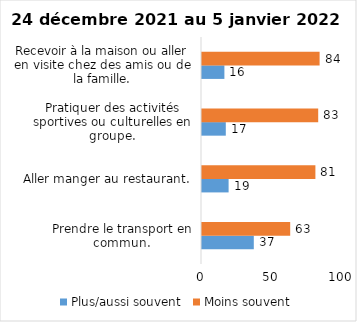
| Category | Plus/aussi souvent | Moins souvent |
|---|---|---|
| Prendre le transport en commun. | 37 | 63 |
| Aller manger au restaurant. | 19 | 81 |
| Pratiquer des activités sportives ou culturelles en groupe. | 17 | 83 |
| Recevoir à la maison ou aller en visite chez des amis ou de la famille. | 16 | 84 |